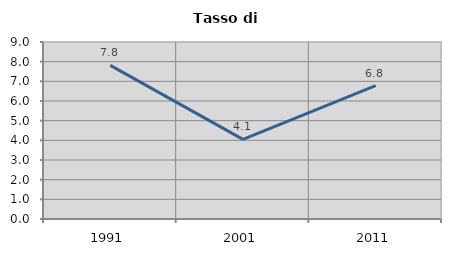
| Category | Tasso di disoccupazione   |
|---|---|
| 1991.0 | 7.809 |
| 2001.0 | 4.051 |
| 2011.0 | 6.784 |